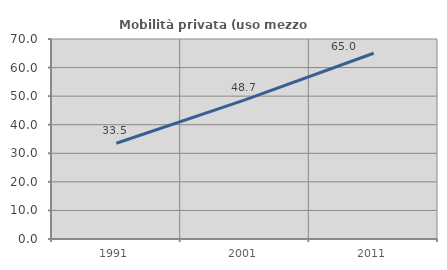
| Category | Mobilità privata (uso mezzo privato) |
|---|---|
| 1991.0 | 33.516 |
| 2001.0 | 48.697 |
| 2011.0 | 65.021 |